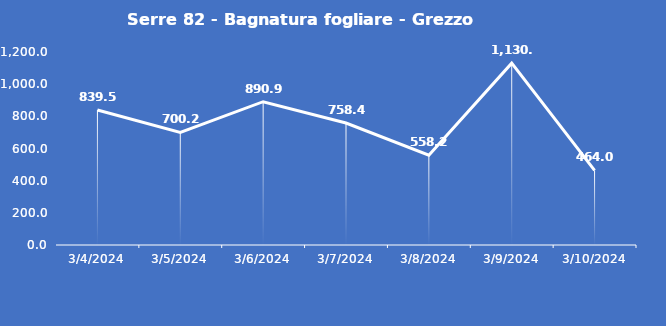
| Category | Serre 82 - Bagnatura fogliare - Grezzo (min) |
|---|---|
| 3/4/24 | 839.5 |
| 3/5/24 | 700.2 |
| 3/6/24 | 890.9 |
| 3/7/24 | 758.4 |
| 3/8/24 | 558.2 |
| 3/9/24 | 1130.5 |
| 3/10/24 | 464 |